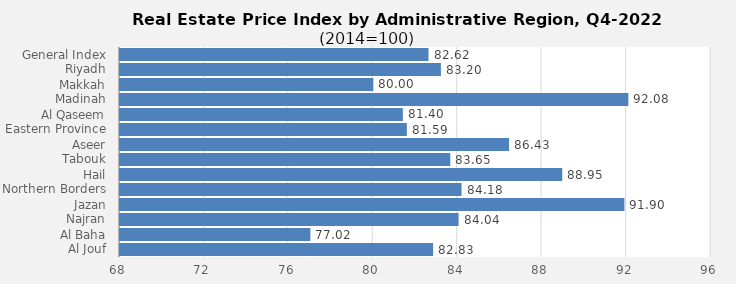
| Category | 2022 |
|---|---|
| General Index | 82.616 |
| Riyadh | 83.204 |
| Makkah | 80.003 |
| Madinah | 92.084 |
| Al Qaseem | 81.401 |
| Eastern Province | 81.591 |
| Aseer | 86.434 |
| Tabouk | 83.649 |
| Hail | 88.953 |
| Northern Borders | 84.181 |
| Jazan | 91.898 |
| Najran | 84.043 |
| Al Baha | 77.02 |
| Al Jouf | 82.834 |